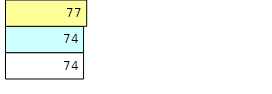
| Category | Total Standouts | Total Recd | Total Tipsters |
|---|---|---|---|
| 0 | 74 | 74 | 77 |